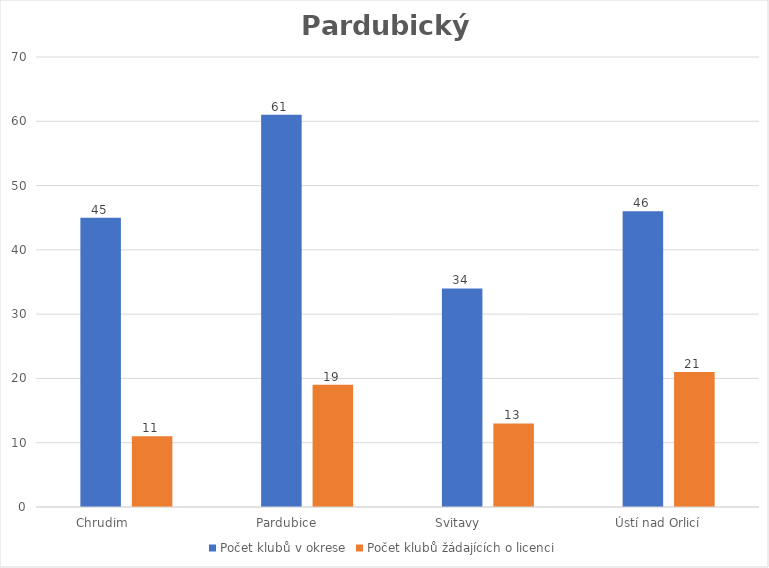
| Category | Počet klubů v okrese | Počet klubů žádajících o licenci |
|---|---|---|
| Chrudim             | 45 | 11 |
| Pardubice           | 61 | 19 |
| Svitavy                | 34 | 13 |
| Ústí nad Orlicí      | 46 | 21 |